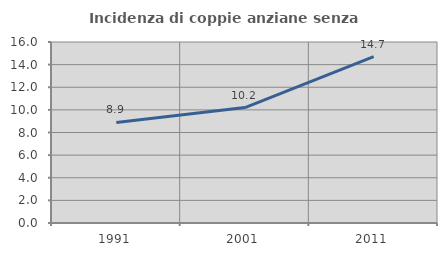
| Category | Incidenza di coppie anziane senza figli  |
|---|---|
| 1991.0 | 8.891 |
| 2001.0 | 10.204 |
| 2011.0 | 14.703 |